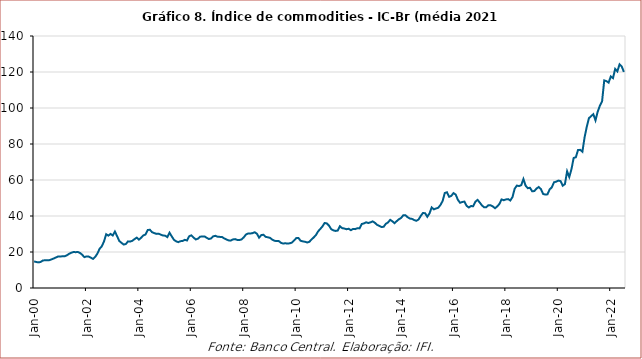
| Category | IC-BR |
|---|---|
| 2000-01-01 | 14.779 |
| 2000-02-01 | 14.437 |
| 2000-03-01 | 14.232 |
| 2000-04-01 | 14.462 |
| 2000-05-01 | 15.287 |
| 2000-06-01 | 15.394 |
| 2000-07-01 | 15.397 |
| 2000-08-01 | 15.471 |
| 2000-09-01 | 15.903 |
| 2000-10-01 | 16.414 |
| 2000-11-01 | 16.966 |
| 2000-12-01 | 17.504 |
| 2001-01-01 | 17.481 |
| 2001-02-01 | 17.639 |
| 2001-03-01 | 17.61 |
| 2001-04-01 | 18.171 |
| 2001-05-01 | 18.993 |
| 2001-06-01 | 19.574 |
| 2001-07-01 | 19.996 |
| 2001-08-01 | 19.901 |
| 2001-09-01 | 20.002 |
| 2001-10-01 | 19.496 |
| 2001-11-01 | 18.493 |
| 2001-12-01 | 17.162 |
| 2002-01-01 | 17.55 |
| 2002-02-01 | 17.458 |
| 2002-03-01 | 16.831 |
| 2002-04-01 | 16.164 |
| 2002-05-01 | 17.349 |
| 2002-06-01 | 19.16 |
| 2002-07-01 | 21.807 |
| 2002-08-01 | 23.175 |
| 2002-09-01 | 25.852 |
| 2002-10-01 | 29.876 |
| 2002-11-01 | 29.112 |
| 2002-12-01 | 30.057 |
| 2003-01-01 | 29.163 |
| 2003-02-01 | 31.348 |
| 2003-03-01 | 28.798 |
| 2003-04-01 | 26.113 |
| 2003-05-01 | 25.104 |
| 2003-06-01 | 24.136 |
| 2003-07-01 | 24.44 |
| 2003-08-01 | 25.901 |
| 2003-09-01 | 25.774 |
| 2003-10-01 | 26.251 |
| 2003-11-01 | 27.177 |
| 2003-12-01 | 27.968 |
| 2004-01-01 | 26.881 |
| 2004-02-01 | 27.919 |
| 2004-03-01 | 29.201 |
| 2004-04-01 | 29.701 |
| 2004-05-01 | 32.219 |
| 2004-06-01 | 32.363 |
| 2004-07-01 | 31.012 |
| 2004-08-01 | 30.509 |
| 2004-09-01 | 30.072 |
| 2004-10-01 | 30.158 |
| 2004-11-01 | 29.646 |
| 2004-12-01 | 29.158 |
| 2005-01-01 | 29.066 |
| 2005-02-01 | 28.269 |
| 2005-03-01 | 30.707 |
| 2005-04-01 | 28.706 |
| 2005-05-01 | 26.803 |
| 2005-06-01 | 25.935 |
| 2005-07-01 | 25.492 |
| 2005-08-01 | 26.004 |
| 2005-09-01 | 26.148 |
| 2005-10-01 | 26.76 |
| 2005-11-01 | 26.389 |
| 2005-12-01 | 28.747 |
| 2006-01-01 | 29.267 |
| 2006-02-01 | 28.048 |
| 2006-03-01 | 26.967 |
| 2006-04-01 | 27.393 |
| 2006-05-01 | 28.494 |
| 2006-06-01 | 28.64 |
| 2006-07-01 | 28.675 |
| 2006-08-01 | 27.899 |
| 2006-09-01 | 27.212 |
| 2006-10-01 | 27.528 |
| 2006-11-01 | 28.712 |
| 2006-12-01 | 28.979 |
| 2007-01-01 | 28.491 |
| 2007-02-01 | 28.399 |
| 2007-03-01 | 28.387 |
| 2007-04-01 | 27.559 |
| 2007-05-01 | 26.996 |
| 2007-06-01 | 26.455 |
| 2007-07-01 | 26.326 |
| 2007-08-01 | 26.976 |
| 2007-09-01 | 27.143 |
| 2007-10-01 | 26.723 |
| 2007-11-01 | 26.674 |
| 2007-12-01 | 26.97 |
| 2008-01-01 | 28.172 |
| 2008-02-01 | 29.738 |
| 2008-03-01 | 30.287 |
| 2008-04-01 | 30.282 |
| 2008-05-01 | 30.48 |
| 2008-06-01 | 30.974 |
| 2008-07-01 | 30.167 |
| 2008-08-01 | 27.965 |
| 2008-09-01 | 29.385 |
| 2008-10-01 | 29.6 |
| 2008-11-01 | 28.425 |
| 2008-12-01 | 28.166 |
| 2009-01-01 | 27.876 |
| 2009-02-01 | 26.875 |
| 2009-03-01 | 26.251 |
| 2009-04-01 | 26.076 |
| 2009-05-01 | 26.105 |
| 2009-06-01 | 25.107 |
| 2009-07-01 | 24.685 |
| 2009-08-01 | 24.872 |
| 2009-09-01 | 24.67 |
| 2009-10-01 | 24.831 |
| 2009-11-01 | 25.205 |
| 2009-12-01 | 26.381 |
| 2010-01-01 | 27.7 |
| 2010-02-01 | 27.798 |
| 2010-03-01 | 26.246 |
| 2010-04-01 | 25.906 |
| 2010-05-01 | 25.691 |
| 2010-06-01 | 25.285 |
| 2010-07-01 | 25.648 |
| 2010-08-01 | 26.953 |
| 2010-09-01 | 28.097 |
| 2010-10-01 | 29.373 |
| 2010-11-01 | 31.44 |
| 2010-12-01 | 32.785 |
| 2011-01-01 | 34.217 |
| 2011-02-01 | 36.126 |
| 2011-03-01 | 35.867 |
| 2011-04-01 | 34.665 |
| 2011-05-01 | 32.696 |
| 2011-06-01 | 32.012 |
| 2011-07-01 | 31.693 |
| 2011-08-01 | 31.914 |
| 2011-09-01 | 34.309 |
| 2011-10-01 | 33.271 |
| 2011-11-01 | 33.053 |
| 2011-12-01 | 32.662 |
| 2012-01-01 | 32.909 |
| 2012-02-01 | 32.11 |
| 2012-03-01 | 32.8 |
| 2012-04-01 | 32.714 |
| 2012-05-01 | 33.231 |
| 2012-06-01 | 33.128 |
| 2012-07-01 | 35.588 |
| 2012-08-01 | 35.853 |
| 2012-09-01 | 36.491 |
| 2012-10-01 | 36.109 |
| 2012-11-01 | 36.491 |
| 2012-12-01 | 37.011 |
| 2013-01-01 | 36.252 |
| 2013-02-01 | 35.071 |
| 2013-03-01 | 34.528 |
| 2013-04-01 | 33.924 |
| 2013-05-01 | 33.976 |
| 2013-06-01 | 35.654 |
| 2013-07-01 | 36.399 |
| 2013-08-01 | 37.862 |
| 2013-09-01 | 37.051 |
| 2013-10-01 | 36.014 |
| 2013-11-01 | 37.149 |
| 2013-12-01 | 38.19 |
| 2014-01-01 | 38.914 |
| 2014-02-01 | 40.386 |
| 2014-03-01 | 40.435 |
| 2014-04-01 | 39.322 |
| 2014-05-01 | 38.601 |
| 2014-06-01 | 38.391 |
| 2014-07-01 | 37.744 |
| 2014-08-01 | 37.333 |
| 2014-09-01 | 38.058 |
| 2014-10-01 | 40.038 |
| 2014-11-01 | 41.674 |
| 2014-12-01 | 41.55 |
| 2015-01-01 | 39.567 |
| 2015-02-01 | 41.384 |
| 2015-03-01 | 44.756 |
| 2015-04-01 | 43.683 |
| 2015-05-01 | 44.183 |
| 2015-06-01 | 44.577 |
| 2015-07-01 | 46.089 |
| 2015-08-01 | 48.294 |
| 2015-09-01 | 52.784 |
| 2015-10-01 | 53.19 |
| 2015-11-01 | 50.637 |
| 2015-12-01 | 51.212 |
| 2016-01-01 | 52.718 |
| 2016-02-01 | 51.899 |
| 2016-03-01 | 48.987 |
| 2016-04-01 | 47.351 |
| 2016-05-01 | 47.791 |
| 2016-06-01 | 48.001 |
| 2016-07-01 | 45.641 |
| 2016-08-01 | 44.733 |
| 2016-09-01 | 45.514 |
| 2016-10-01 | 45.44 |
| 2016-11-01 | 47.938 |
| 2016-12-01 | 48.958 |
| 2017-01-01 | 47.498 |
| 2017-02-01 | 45.88 |
| 2017-03-01 | 44.865 |
| 2017-04-01 | 44.888 |
| 2017-05-01 | 46.006 |
| 2017-06-01 | 45.92 |
| 2017-07-01 | 45.296 |
| 2017-08-01 | 44.336 |
| 2017-09-01 | 45.287 |
| 2017-10-01 | 46.719 |
| 2017-11-01 | 49.2 |
| 2017-12-01 | 48.769 |
| 2018-01-01 | 49.214 |
| 2018-02-01 | 49.381 |
| 2018-03-01 | 48.608 |
| 2018-04-01 | 50.545 |
| 2018-05-01 | 55.17 |
| 2018-06-01 | 56.898 |
| 2018-07-01 | 56.642 |
| 2018-08-01 | 57.114 |
| 2018-09-01 | 60.537 |
| 2018-10-01 | 56.841 |
| 2018-11-01 | 55.458 |
| 2018-12-01 | 55.691 |
| 2019-01-01 | 53.73 |
| 2019-02-01 | 53.865 |
| 2019-03-01 | 55.248 |
| 2019-04-01 | 56.093 |
| 2019-05-01 | 54.984 |
| 2019-06-01 | 52.279 |
| 2019-07-01 | 51.885 |
| 2019-08-01 | 52.028 |
| 2019-09-01 | 54.748 |
| 2019-10-01 | 55.955 |
| 2019-11-01 | 58.721 |
| 2019-12-01 | 59.086 |
| 2020-01-01 | 59.666 |
| 2020-02-01 | 59.396 |
| 2020-03-01 | 56.838 |
| 2020-04-01 | 57.726 |
| 2020-05-01 | 64.829 |
| 2020-06-01 | 61.682 |
| 2020-07-01 | 66.051 |
| 2020-08-01 | 72.252 |
| 2020-09-01 | 72.64 |
| 2020-10-01 | 76.664 |
| 2020-11-01 | 76.753 |
| 2020-12-01 | 75.713 |
| 2021-01-01 | 83.704 |
| 2021-02-01 | 89.589 |
| 2021-03-01 | 94.352 |
| 2021-04-01 | 95.496 |
| 2021-05-01 | 96.551 |
| 2021-06-01 | 93.122 |
| 2021-07-01 | 97.937 |
| 2021-08-01 | 101.266 |
| 2021-09-01 | 103.623 |
| 2021-10-01 | 115.317 |
| 2021-11-01 | 114.932 |
| 2021-12-01 | 114.112 |
| 2022-01-01 | 117.528 |
| 2022-02-01 | 116.605 |
| 2022-03-01 | 121.71 |
| 2022-04-01 | 120.342 |
| 2022-05-01 | 124.217 |
| 2022-06-01 | 123.041 |
| 2022-07-01 | 120.051 |